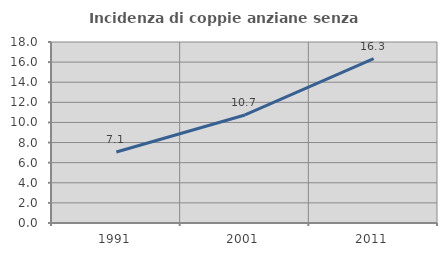
| Category | Incidenza di coppie anziane senza figli  |
|---|---|
| 1991.0 | 7.06 |
| 2001.0 | 10.744 |
| 2011.0 | 16.345 |